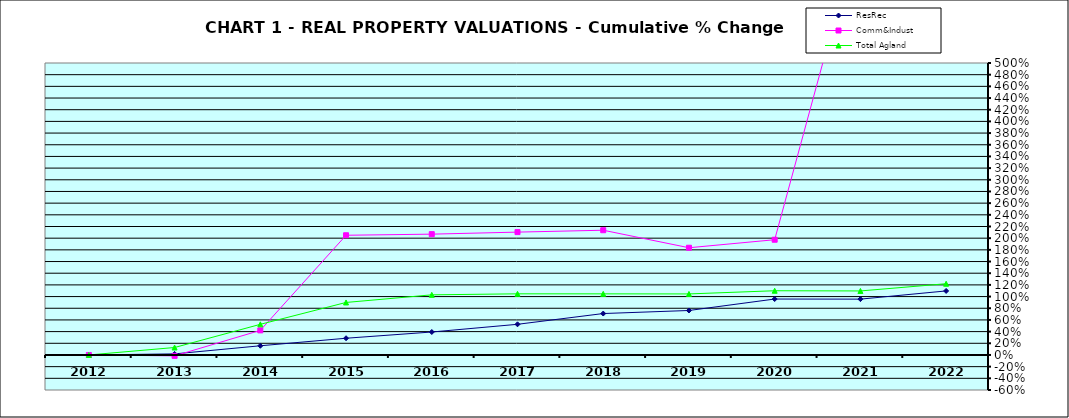
| Category | ResRec | Comm&Indust | Total Agland |
|---|---|---|---|
| 2012.0 | 0 | 0 | 0 |
| 2013.0 | 0.018 | -0.015 | 0.128 |
| 2014.0 | 0.157 | 0.421 | 0.524 |
| 2015.0 | 0.286 | 2.05 | 0.899 |
| 2016.0 | 0.393 | 2.069 | 1.03 |
| 2017.0 | 0.525 | 2.104 | 1.047 |
| 2018.0 | 0.709 | 2.136 | 1.046 |
| 2019.0 | 0.762 | 1.836 | 1.045 |
| 2020.0 | 0.958 | 1.973 | 1.1 |
| 2021.0 | 0.956 | 7.369 | 1.096 |
| 2022.0 | 1.097 | 8.311 | 1.22 |